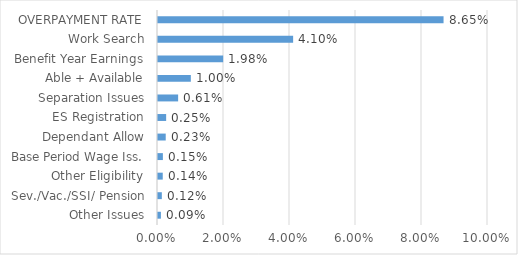
| Category | Series 0 |
|---|---|
| Other Issues | 0.001 |
| Sev./Vac./SSI/ Pension | 0.001 |
| Other Eligibility | 0.001 |
| Base Period Wage Iss. | 0.001 |
| Dependant Allow | 0.002 |
| ES Registration | 0.002 |
| Separation Issues | 0.006 |
| Able + Available | 0.01 |
| Benefit Year Earnings | 0.02 |
| Work Search | 0.041 |
| OVERPAYMENT RATE | 0.087 |